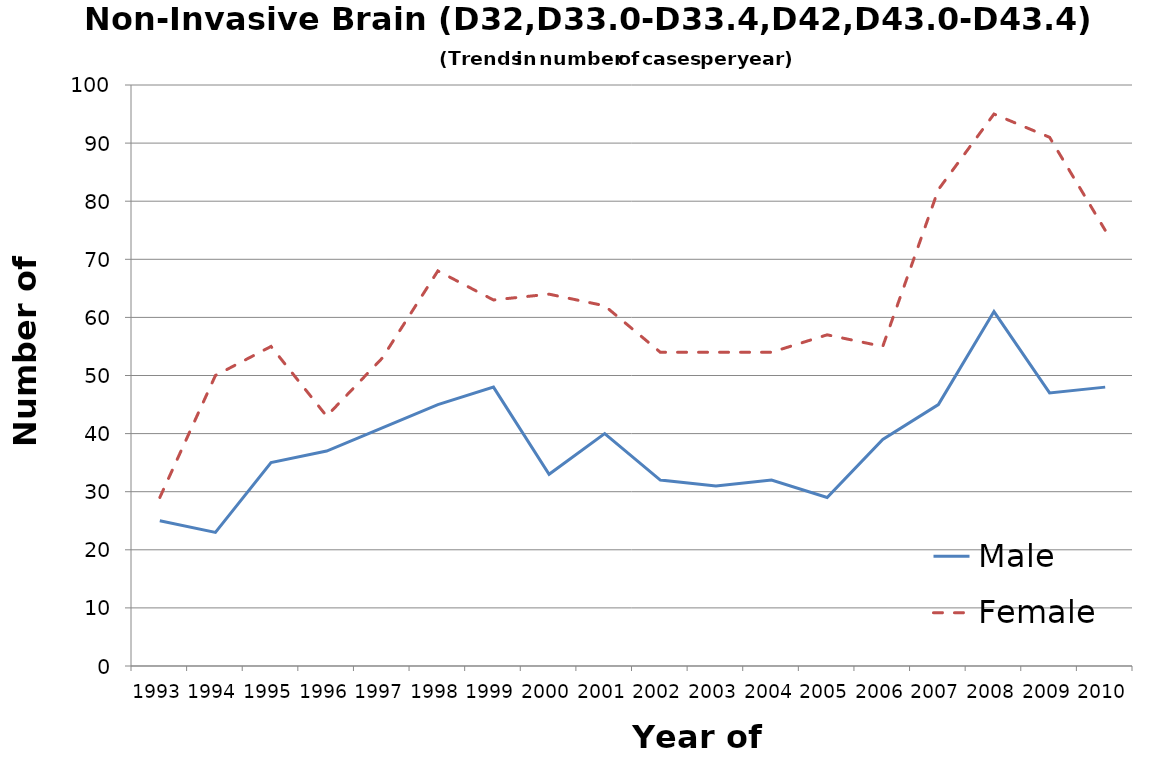
| Category | Male | Female |
|---|---|---|
| 1993.0 | 25 | 29 |
| 1994.0 | 23 | 50 |
| 1995.0 | 35 | 55 |
| 1996.0 | 37 | 43 |
| 1997.0 | 41 | 53 |
| 1998.0 | 45 | 68 |
| 1999.0 | 48 | 63 |
| 2000.0 | 33 | 64 |
| 2001.0 | 40 | 62 |
| 2002.0 | 32 | 54 |
| 2003.0 | 31 | 54 |
| 2004.0 | 32 | 54 |
| 2005.0 | 29 | 57 |
| 2006.0 | 39 | 55 |
| 2007.0 | 45 | 82 |
| 2008.0 | 61 | 95 |
| 2009.0 | 47 | 91 |
| 2010.0 | 48 | 75 |